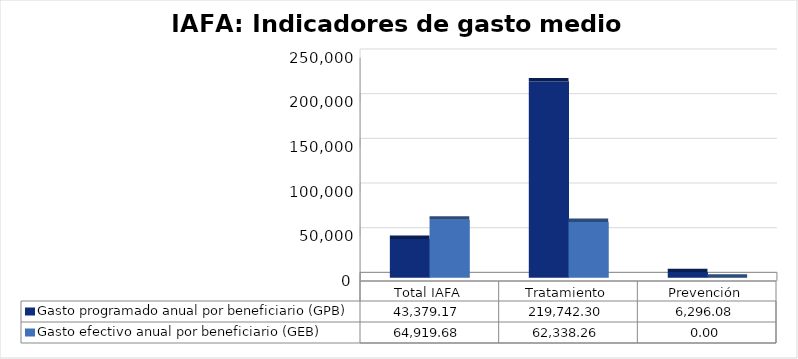
| Category | Gasto programado anual por beneficiario (GPB)  | Gasto efectivo anual por beneficiario (GEB)  |
|---|---|---|
| Total IAFA | 43379.169 | 64919.682 |
| Tratamiento | 219742.303 | 62338.26 |
| Prevención | 6296.076 | 0 |